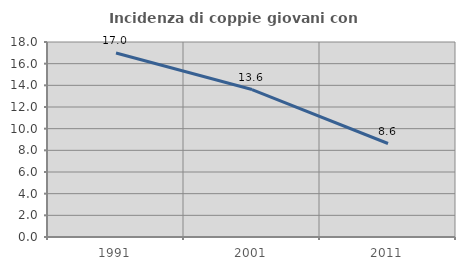
| Category | Incidenza di coppie giovani con figli |
|---|---|
| 1991.0 | 16.99 |
| 2001.0 | 13.611 |
| 2011.0 | 8.63 |